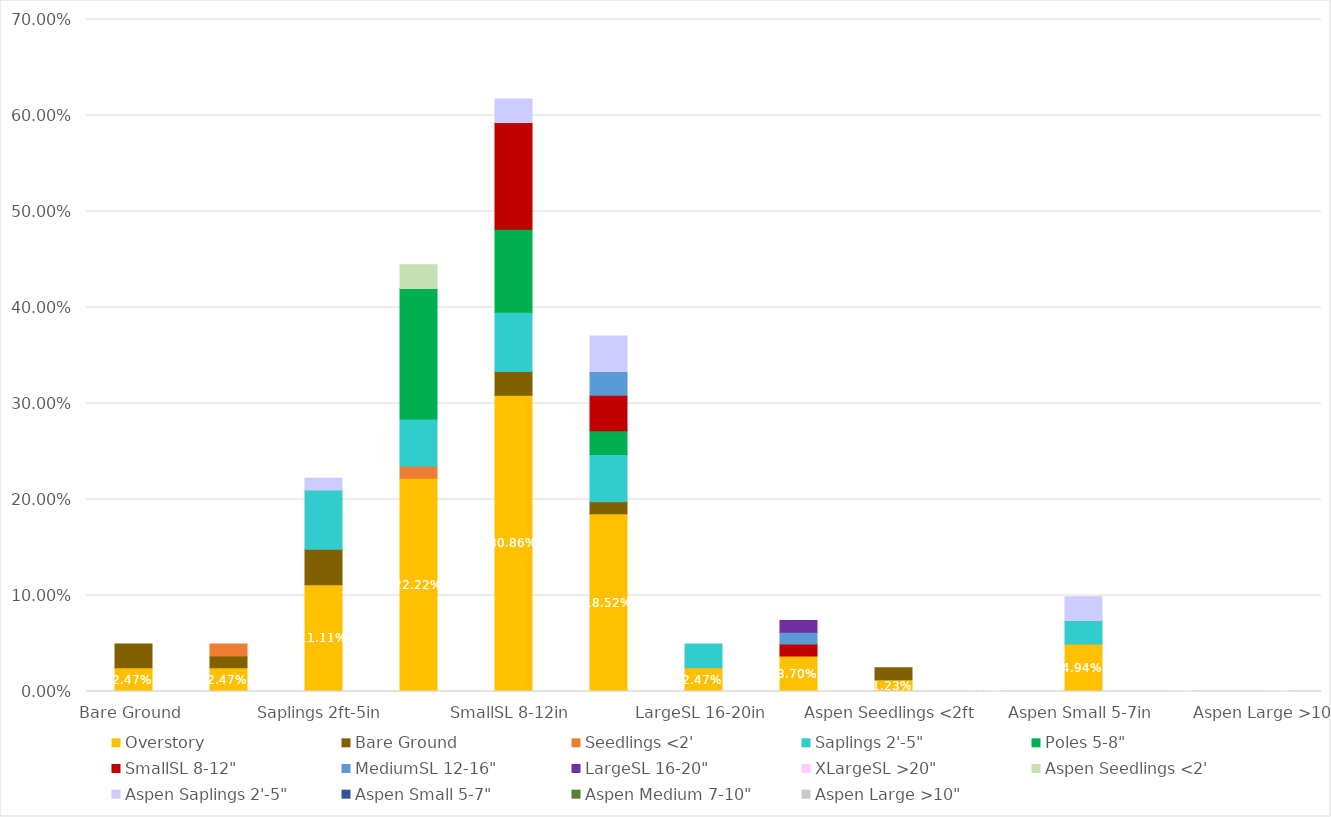
| Category | Overstory | Bare Ground | Seedlings <2' | Saplings 2'-5" | Poles 5-8" | SmallSL 8-12" | MediumSL 12-16" | LargeSL 16-20" | XLargeSL >20" | Aspen Seedlings <2' | Aspen Saplings 2'-5" | Aspen Small 5-7" | Aspen Medium 7-10" | Aspen Large >10" |
|---|---|---|---|---|---|---|---|---|---|---|---|---|---|---|
| Bare Ground | 0.025 | 0.025 | 0 | 0 | 0 | 0 | 0 | 0 | 0 | 0 | 0 | 0 | 0 | 0 |
| Seedlings <2ft | 0.025 | 0.012 | 0.012 | 0 | 0 | 0 | 0 | 0 | 0 | 0 | 0 | 0 | 0 | 0 |
| Saplings 2ft-5in | 0.111 | 0.037 | 0 | 0.062 | 0 | 0 | 0 | 0 | 0 | 0 | 0.012 | 0 | 0 | 0 |
| Poles 5-8in | 0.222 | 0 | 0.012 | 0.049 | 0.136 | 0 | 0 | 0 | 0 | 0.025 | 0 | 0 | 0 | 0 |
| SmallSL 8-12in | 0.309 | 0.025 | 0 | 0.062 | 0.086 | 0.111 | 0 | 0 | 0 | 0 | 0.025 | 0 | 0 | 0 |
| MediumSL 12-16in | 0.185 | 0.012 | 0 | 0.049 | 0.025 | 0.037 | 0.025 | 0 | 0 | 0 | 0.037 | 0 | 0 | 0 |
| LargeSL 16-20in | 0.025 | 0 | 0 | 0.025 | 0 | 0 | 0 | 0 | 0 | 0 | 0 | 0 | 0 | 0 |
| XLargeSL >20in | 0.037 | 0 | 0 | 0 | 0 | 0.012 | 0.012 | 0.012 | 0 | 0 | 0 | 0 | 0 | 0 |
| Aspen Seedlings <2ft | 0.012 | 0.012 | 0 | 0 | 0 | 0 | 0 | 0 | 0 | 0 | 0 | 0 | 0 | 0 |
| Aspen Saplings 2ft-5in | 0 | 0 | 0 | 0 | 0 | 0 | 0 | 0 | 0 | 0 | 0 | 0 | 0 | 0 |
| Aspen Small 5-7in | 0.049 | 0 | 0 | 0.025 | 0 | 0 | 0 | 0 | 0 | 0 | 0.025 | 0 | 0 | 0 |
| Aspen Medium 7-10in | 0 | 0 | 0 | 0 | 0 | 0 | 0 | 0 | 0 | 0 | 0 | 0 | 0 | 0 |
| Aspen Large >10in | 0 | 0 | 0 | 0 | 0 | 0 | 0 | 0 | 0 | 0 | 0 | 0 | 0 | 0 |